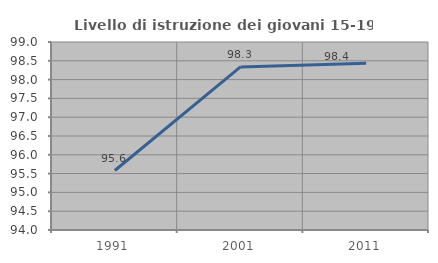
| Category | Livello di istruzione dei giovani 15-19 anni |
|---|---|
| 1991.0 | 95.582 |
| 2001.0 | 98.338 |
| 2011.0 | 98.436 |